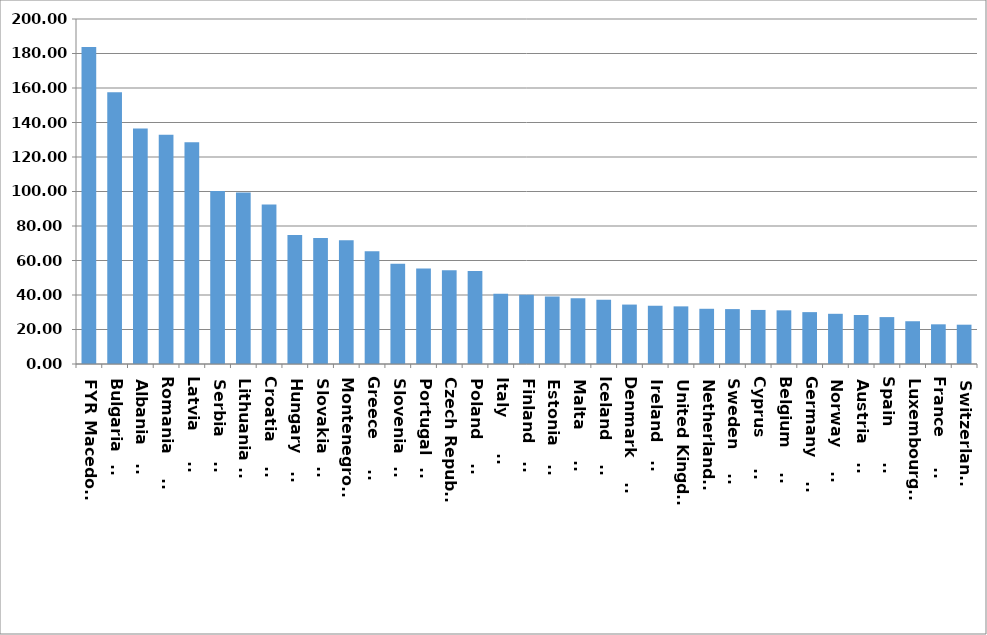
| Category | Series 0 |
|---|---|
| FYR Macedonia | 183.72 |
| Bulgaria       | 157.53 |
| Albania        | 136.49 |
| Romania        | 132.91 |
| Latvia         | 128.61 |
| Serbia         | 100.22 |
| Lithuania      | 99.36 |
| Croatia        | 92.45 |
| Hungary        | 74.82 |
| Slovakia       | 73.03 |
| Montenegro     | 71.77 |
| Greece         | 65.35 |
| Slovenia       | 58.09 |
| Portugal       | 55.36 |
| Czech Republic | 54.3 |
| Poland         | 53.87 |
| Italy          | 40.78 |
| Finland        | 40.11 |
| Estonia        | 39.17 |
| Malta          | 38.16 |
| Iceland        | 37.23 |
| Denmark        | 34.45 |
| Ireland        | 33.77 |
| United Kingdom | 33.41 |
| Netherlands    | 32.01 |
| Sweden         | 31.83 |
| Cyprus         | 31.34 |
| Belgium        | 31.11 |
| Germany        | 30.07 |
| Norway         | 29.1 |
| Austria        | 28.4 |
| Spain          | 27.19 |
| Luxembourg     | 24.79 |
| France         | 23 |
| Switzerland    | 22.79 |